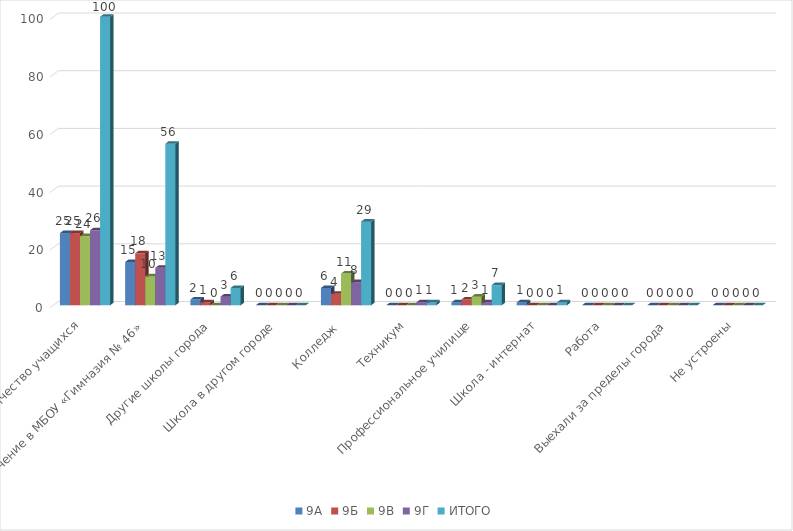
| Category | 9А | 9Б | 9В | 9Г | ИТОГО |
|---|---|---|---|---|---|
| Количество учащихся | 25 | 25 | 24 | 26 | 100 |
| Обучение в МБОУ «Гимназия № 46» | 15 | 18 | 10 | 13 | 56 |
| Другие школы города | 2 | 1 | 0 | 3 | 6 |
| Школа в другом городе | 0 | 0 | 0 | 0 | 0 |
| Колледж  | 6 | 4 | 11 | 8 | 29 |
| Техникум | 0 | 0 | 0 | 1 | 1 |
| Профессиональное училище | 1 | 2 | 3 | 1 | 7 |
| Школа - интернат | 1 | 0 | 0 | 0 | 1 |
| Работа | 0 | 0 | 0 | 0 | 0 |
| Выехали за пределы города | 0 | 0 | 0 | 0 | 0 |
| Не устроены | 0 | 0 | 0 | 0 | 0 |